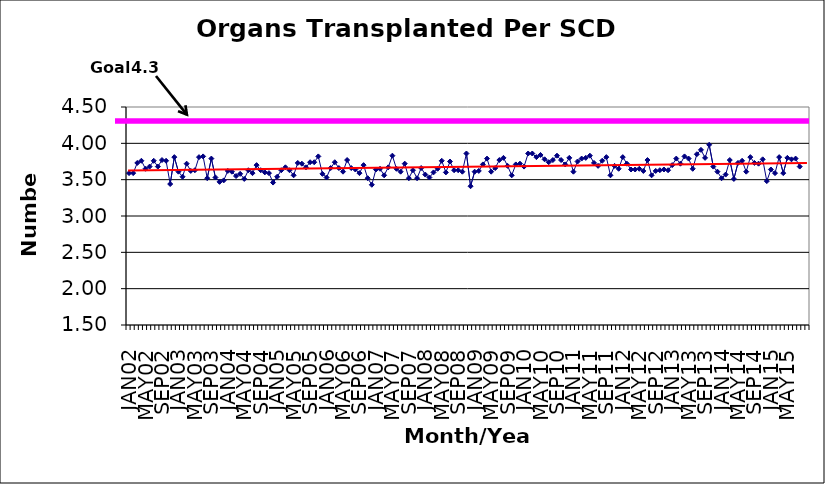
| Category | Series 0 |
|---|---|
| JAN02 | 3.59 |
| FEB02 | 3.59 |
| MAR02 | 3.73 |
| APR02 | 3.76 |
| MAY02 | 3.65 |
| JUN02 | 3.68 |
| JUL02 | 3.76 |
| AUG02 | 3.68 |
| SEP02 | 3.77 |
| OCT02 | 3.76 |
| NOV02 | 3.44 |
| DEC02 | 3.81 |
| JAN03 | 3.61 |
| FEB03 | 3.54 |
| MAR03 | 3.72 |
| APR03 | 3.62 |
| MAY03 | 3.63 |
| JUN03 | 3.81 |
| JUL03 | 3.82 |
| AUG03 | 3.52 |
| SEP03 | 3.79 |
| OCT03 | 3.53 |
| NOV03 | 3.47 |
| DEC03 | 3.49 |
| JAN04 | 3.62 |
| FEB04 | 3.61 |
| MAR04 | 3.55 |
| APR04 | 3.58 |
| MAY04 | 3.51 |
| JUN04 | 3.63 |
| JUL04 | 3.59 |
| AUG04 | 3.7 |
| SEP04 | 3.63 |
| OCT04 | 3.6 |
| NOV04 | 3.59 |
| DEC04 | 3.46 |
| JAN05 | 3.54 |
| FEB05 | 3.63 |
| MAR05 | 3.67 |
| APR05 | 3.63 |
| MAY05 | 3.56 |
| JUN05 | 3.73 |
| JUL05 | 3.72 |
| AUG05 | 3.67 |
| SEP05 | 3.74 |
| OCT05 | 3.74 |
| NOV05 | 3.82 |
| DEC05 | 3.58 |
| JAN06 | 3.53 |
| FEB06 | 3.66 |
| MAR06 | 3.74 |
| APR06 | 3.66 |
| MAY06 | 3.61 |
| JUN06 | 3.77 |
| JUL06 | 3.66 |
| AUG06 | 3.64 |
| SEP06 | 3.59 |
| OCT06 | 3.7 |
| NOV06 | 3.52 |
| DEC06 | 3.43 |
| JAN07 | 3.64 |
| FEB07 | 3.65 |
| MAR07 | 3.56 |
| APR07 | 3.67 |
| MAY07 | 3.83 |
| JUN07 | 3.65 |
| JUL07 | 3.61 |
| AUG07 | 3.72 |
| SEP07 | 3.52 |
| OCT07 | 3.63 |
| NOV07 | 3.52 |
| DEC07 | 3.66 |
| JAN08 | 3.57 |
| FEB08 | 3.53 |
| MAR08 | 3.6 |
| APR08 | 3.65 |
| MAY08 | 3.76 |
| JUN08 | 3.6 |
| JUL08 | 3.75 |
| AUG08 | 3.63 |
| SEP08 | 3.63 |
| OCT08 | 3.61 |
| NOV08 | 3.86 |
| DEC08 | 3.41 |
| JAN09 | 3.61 |
| FEB09 | 3.62 |
| MAR09 | 3.71 |
| APR09 | 3.79 |
| MAY09 | 3.61 |
| JUN09 | 3.66 |
| JUL09 | 3.77 |
| AUG09 | 3.8 |
| SEP09 | 3.69 |
| OCT09 | 3.56 |
| NOV09 | 3.71 |
| DEC09 | 3.72 |
| JAN10 | 3.68 |
| FEB10 | 3.86 |
| MAR10 | 3.86 |
| APR10 | 3.81 |
| MAY10 | 3.84 |
| JUN10 | 3.78 |
| JUL10 | 3.74 |
| AUG10 | 3.77 |
| SEP10 | 3.83 |
| OCT10 | 3.77 |
| NOV10 | 3.71 |
| DEC10 | 3.8 |
| JAN11 | 3.61 |
| FEB11 | 3.75 |
| MAR11 | 3.79 |
| APR11 | 3.8 |
| MAY11 | 3.83 |
| JUN11 | 3.73 |
| JUL11 | 3.69 |
| AUG11 | 3.76 |
| SEP11 | 3.81 |
| OCT11 | 3.56 |
| NOV11 | 3.69 |
| DEC11 | 3.65 |
| JAN12 | 3.81 |
| FEB12 | 3.72 |
| MAR12 | 3.64 |
| APR12 | 3.64 |
| MAY12 | 3.65 |
| JUN12 | 3.62 |
| JUL12 | 3.77 |
| AUG12 | 3.56 |
| SEP12 | 3.62 |
| OCT12 | 3.63 |
| NOV12 | 3.64 |
| DEC12 | 3.63 |
| JAN13 | 3.7 |
| FEB13 | 3.79 |
| MAR13 | 3.72 |
| APR13 | 3.82 |
| MAY13 | 3.79 |
| JUN13 | 3.65 |
| JUL13 | 3.85 |
| AUG13 | 3.91 |
| SEP13 | 3.8 |
| OCT13 | 3.98 |
| NOV13 | 3.68 |
| DEC13 | 3.61 |
| JAN14 | 3.52 |
| FEB14 | 3.57 |
| MAR14 | 3.77 |
| APR14 | 3.51 |
| MAY14 | 3.73 |
| JUN14 | 3.76 |
| JUL14 | 3.61 |
| AUG14 | 3.81 |
| SEP14 | 3.73 |
| OCT14 | 3.72 |
| NOV14 | 3.78 |
| DEC14 | 3.48 |
| JAN15 | 3.64 |
| FEB15 | 3.59 |
| MAR15 | 3.81 |
| APR15 | 3.59 |
| MAY15 | 3.8 |
| JUN15 | 3.78 |
| JUL15 | 3.79 |
| AUG15 | 3.68 |